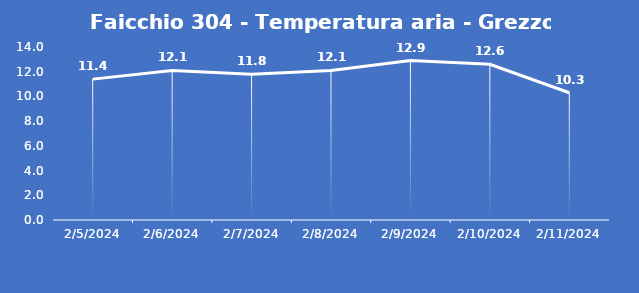
| Category | Faicchio 304 - Temperatura aria - Grezzo (°C) |
|---|---|
| 2/5/24 | 11.4 |
| 2/6/24 | 12.1 |
| 2/7/24 | 11.8 |
| 2/8/24 | 12.1 |
| 2/9/24 | 12.9 |
| 2/10/24 | 12.6 |
| 2/11/24 | 10.3 |